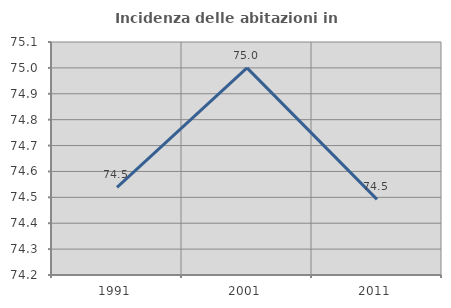
| Category | Incidenza delle abitazioni in proprietà  |
|---|---|
| 1991.0 | 74.538 |
| 2001.0 | 75 |
| 2011.0 | 74.492 |